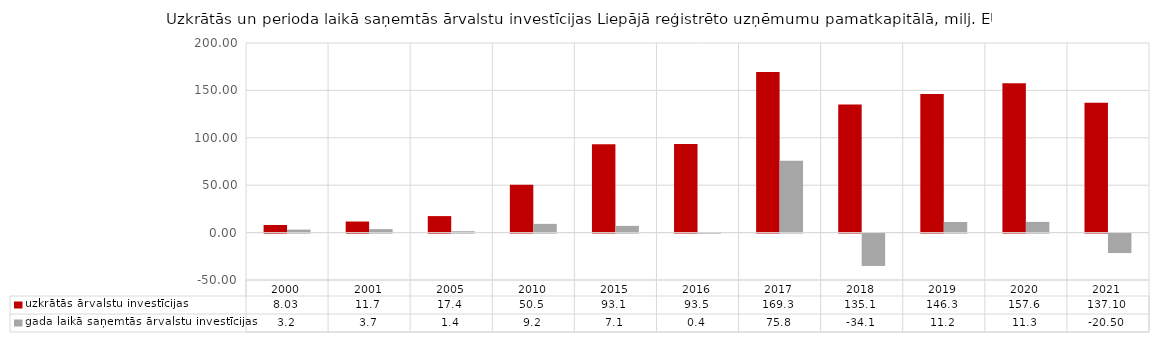
| Category | uzkrātās ārvalstu investīcijas | gada laikā saņemtās ārvalstu investīcijas |
|---|---|---|
| 2000.0 | 8.03 | 3.169 |
| 2001.0 | 11.687 | 3.657 |
| 2005.0 | 17.4 | 1.423 |
| 2010.0 | 50.5 | 9.2 |
| 2015.0 | 93.1 | 7.1 |
| 2016.0 | 93.5 | 0.4 |
| 2017.0 | 169.3 | 75.8 |
| 2018.0 | 135.1 | -34.1 |
| 2019.0 | 146.3 | 11.2 |
| 2020.0 | 157.6 | 11.3 |
| 2021.0 | 137.1 | -20.5 |